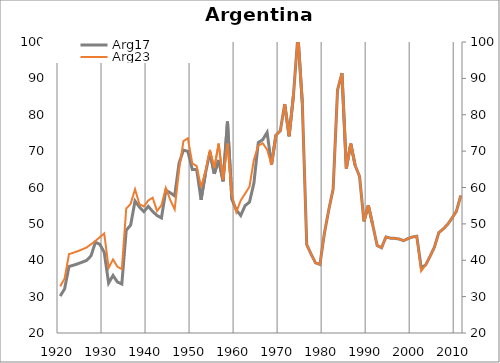
| Category | Arg17 |
|---|---|
| 1920.0 | 30.156 |
| 1921.0 | 32.114 |
| 1922.0 | 38.285 |
| 1923.0 | 38.638 |
| 1924.0 | 39.035 |
| 1925.0 | 39.478 |
| 1926.0 | 39.967 |
| 1927.0 | 41.211 |
| 1928.0 | 44.945 |
| 1929.0 | 44.392 |
| 1930.0 | 42.179 |
| 1931.0 | 33.743 |
| 1932.0 | 35.818 |
| 1933.0 | 34.02 |
| 1934.0 | 33.467 |
| 1935.0 | 48.264 |
| 1936.0 | 49.647 |
| 1937.0 | 56.285 |
| 1938.0 | 54.628 |
| 1939.0 | 53.358 |
| 1940.0 | 54.82 |
| 1941.0 | 53.412 |
| 1942.0 | 52.302 |
| 1943.0 | 51.627 |
| 1944.0 | 59.22 |
| 1945.0 | 58.552 |
| 1946.0 | 57.694 |
| 1947.0 | 66.679 |
| 1948.0 | 70.274 |
| 1949.0 | 69.937 |
| 1950.0 | 64.958 |
| 1951.0 | 64.986 |
| 1952.0 | 56.603 |
| 1953.0 | 63.923 |
| 1954.0 | 69.728 |
| 1955.0 | 63.76 |
| 1956.0 | 67.562 |
| 1957.0 | 61.704 |
| 1958.0 | 78.131 |
| 1959.0 | 56.718 |
| 1960.0 | 53.838 |
| 1961.0 | 52.306 |
| 1962.0 | 55.005 |
| 1963.0 | 55.998 |
| 1964.0 | 61.178 |
| 1965.0 | 72.371 |
| 1966.0 | 73.133 |
| 1967.0 | 75.143 |
| 1968.0 | 66.234 |
| 1969.0 | 74.355 |
| 1970.0 | 75.612 |
| 1971.0 | 82.931 |
| 1972.0 | 74.094 |
| 1973.0 | 85.524 |
| 1974.0 | 101.909 |
| 1975.0 | 83.171 |
| 1976.0 | 44.285 |
| 1977.0 | 41.658 |
| 1978.0 | 39.273 |
| 1979.0 | 38.832 |
| 1980.0 | 47.279 |
| 1981.0 | 53.835 |
| 1982.0 | 59.571 |
| 1983.0 | 86.804 |
| 1984.0 | 91.469 |
| 1985.0 | 65.245 |
| 1986.0 | 72.053 |
| 1987.0 | 66.064 |
| 1988.0 | 63.038 |
| 1989.0 | 50.683 |
| 1990.0 | 55.096 |
| 1991.0 | 49.674 |
| 1992.0 | 44.064 |
| 1993.0 | 43.433 |
| 1994.0 | 46.396 |
| 1995.0 | 46.081 |
| 1996.0 | 46.018 |
| 1997.0 | 45.829 |
| 1998.0 | 45.388 |
| 1999.0 | 45.955 |
| 2000.0 | 46.396 |
| 2001.0 | 46.588 |
| 2002.0 | 37.948 |
| 2003.0 | 38.678 |
| 2004.0 | 41.02 |
| 2005.0 | 43.591 |
| 2006.0 | 47.571 |
| 2007.0 | 48.594 |
| 2008.0 | 49.84 |
| 2009.0 | 51.573 |
| 2010.0 | 53.46 |
| 2011.0 | 57.799 |